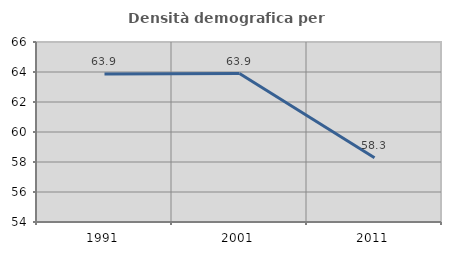
| Category | Densità demografica |
|---|---|
| 1991.0 | 63.866 |
| 2001.0 | 63.893 |
| 2011.0 | 58.284 |